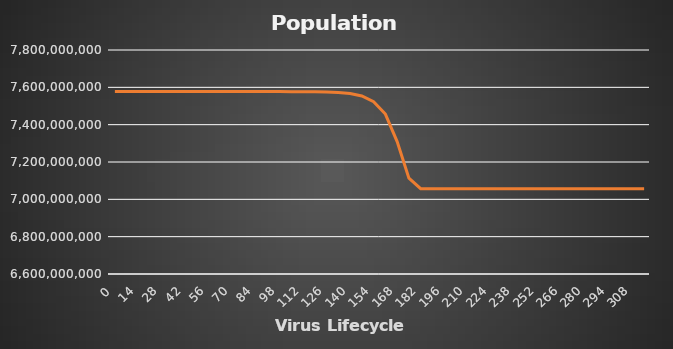
| Category | Population |
|---|---|
| 0.0 | 7577130400 |
| 7.0 | 7577130399.794 |
| 14.0 | 7577130399.247 |
| 21.0 | 7577130397.809 |
| 28.0 | 7577130394.055 |
| 35.0 | 7577130384.335 |
| 42.0 | 7577130359.355 |
| 49.0 | 7577130295.659 |
| 56.0 | 7577130134.514 |
| 63.0 | 7577129730.046 |
| 70.0 | 7577128722.921 |
| 77.0 | 7577126235.281 |
| 84.0 | 7577120140.363 |
| 91.0 | 7577105328.972 |
| 98.0 | 7577069631.111 |
| 105.0 | 7576984305.939 |
| 112.0 | 7576782064.298 |
| 119.0 | 7576306738.184 |
| 126.0 | 7575199071.204 |
| 133.0 | 7572639946.831 |
| 140.0 | 7566778485.713 |
| 147.0 | 7553470271.234 |
| 154.0 | 7523520078.63 |
| 161.0 | 7456714720.748 |
| 168.0 | 7309035249.532 |
| 175.0 | 7113605223.895 |
| 182.0 | 7057071166.022 |
| 189.0 | 7057071166.022 |
| 196.0 | 7057071166.022 |
| 203.0 | 7057071166.022 |
| 210.0 | 7057071166.022 |
| 217.0 | 7057071166.022 |
| 224.0 | 7057071166.022 |
| 231.0 | 7057071166.022 |
| 238.0 | 7057071166.022 |
| 245.0 | 7057071166.022 |
| 252.0 | 7057071166.022 |
| 259.0 | 7057071166.022 |
| 266.0 | 7057071166.022 |
| 273.0 | 7057071166.022 |
| 280.0 | 7057071166.022 |
| 287.0 | 7057071166.022 |
| 294.0 | 7057071166.022 |
| 301.0 | 7057071166.022 |
| 308.0 | 7057071166.022 |
| 315.0 | 7057071166.022 |